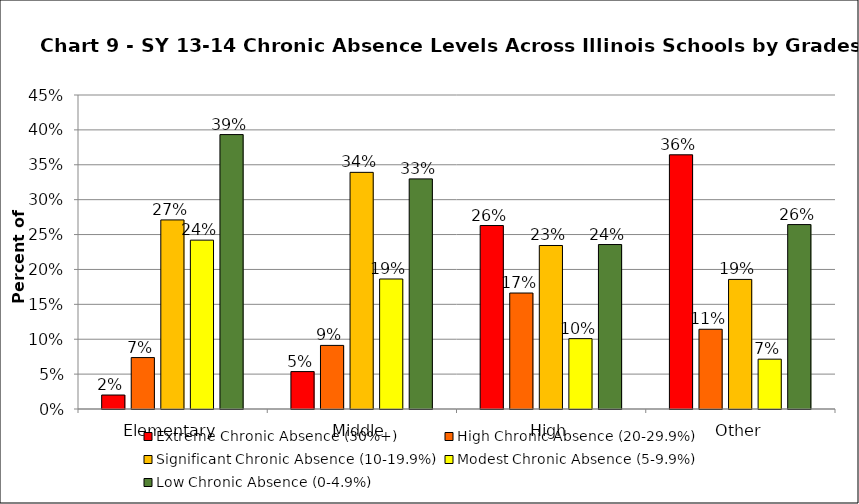
| Category | Extreme Chronic Absence (30%+) | High Chronic Absence (20-29.9%) | Significant Chronic Absence (10-19.9%) | Modest Chronic Absence (5-9.9%) | Low Chronic Absence (0-4.9%) |
|---|---|---|---|---|---|
| 0 | 0.02 | 0.074 | 0.271 | 0.242 | 0.393 |
| 1 | 0.054 | 0.091 | 0.339 | 0.186 | 0.33 |
| 2 | 0.263 | 0.166 | 0.234 | 0.101 | 0.236 |
| 3 | 0.364 | 0.114 | 0.186 | 0.071 | 0.264 |